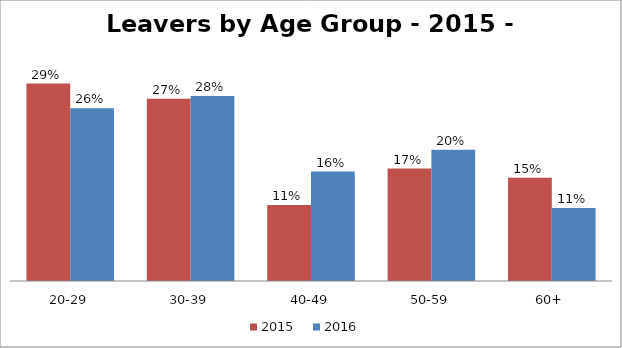
| Category | 2015
 | 2016
 |
|---|---|---|
| 20-29 | 0.294 | 0.257 |
| 30-39 | 0.271 | 0.275 |
| 40-49 | 0.113 | 0.163 |
| 50-59 | 0.167 | 0.196 |
| 60+ | 0.154 | 0.109 |